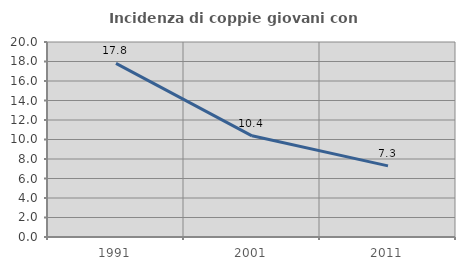
| Category | Incidenza di coppie giovani con figli |
|---|---|
| 1991.0 | 17.815 |
| 2001.0 | 10.379 |
| 2011.0 | 7.293 |